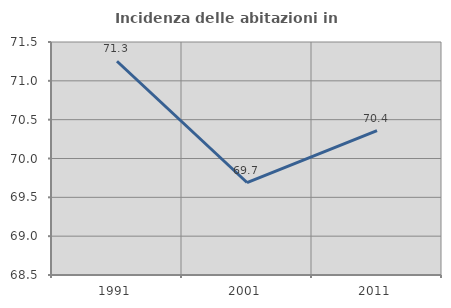
| Category | Incidenza delle abitazioni in proprietà  |
|---|---|
| 1991.0 | 71.252 |
| 2001.0 | 69.691 |
| 2011.0 | 70.358 |